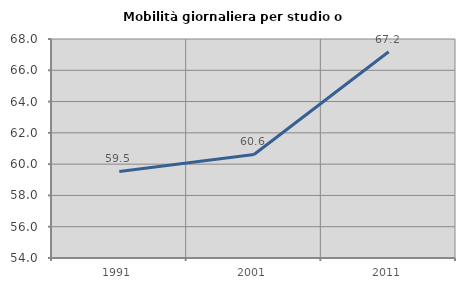
| Category | Mobilità giornaliera per studio o lavoro |
|---|---|
| 1991.0 | 59.533 |
| 2001.0 | 60.621 |
| 2011.0 | 67.184 |